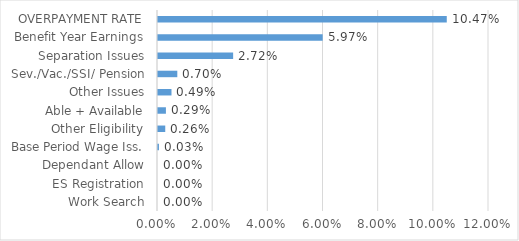
| Category | Series 0 |
|---|---|
| Work Search | 0 |
| ES Registration | 0 |
| Dependant Allow | 0 |
| Base Period Wage Iss. | 0 |
| Other Eligibility | 0.003 |
| Able + Available | 0.003 |
| Other Issues | 0.005 |
| Sev./Vac./SSI/ Pension | 0.007 |
| Separation Issues | 0.027 |
| Benefit Year Earnings | 0.06 |
| OVERPAYMENT RATE | 0.105 |